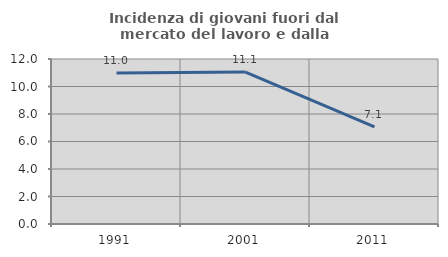
| Category | Incidenza di giovani fuori dal mercato del lavoro e dalla formazione  |
|---|---|
| 1991.0 | 10.976 |
| 2001.0 | 11.053 |
| 2011.0 | 7.071 |